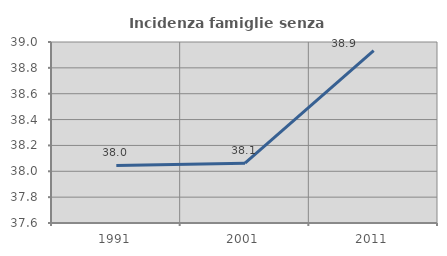
| Category | Incidenza famiglie senza nuclei |
|---|---|
| 1991.0 | 38.045 |
| 2001.0 | 38.063 |
| 2011.0 | 38.933 |